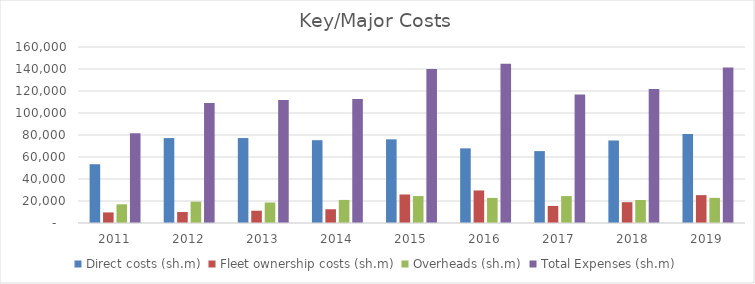
| Category | Direct costs (sh.m) | Fleet ownership costs (sh.m) | Overheads (sh.m) | Total Expenses (sh.m) |
|---|---|---|---|---|
| 2011 | 53419 | 9622 | 16980 | 81588 |
| 2012 | 77217 | 9970 | 19404 | 108992 |
| 2013 | 77225 | 11178 | 18643 | 111709 |
| 2014 | 75268 | 12490 | 20972 | 112665 |
| 2015 | 76059 | 25932 | 24503 | 140026 |
| 2016 | 67861 | 29578 | 22812 | 144879 |
| 2017 | 65356 | 15524 | 24500 | 116853 |
| 2018 | 75030 | 18929 | 20909 | 121818 |
| 2019 | 80977 | 25343 | 22850 | 141322 |